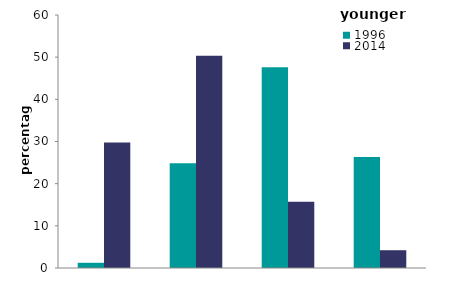
| Category | 1996 | 2014 |
|---|---|---|
| A-C | 1.236 | 29.778 |
| D | 24.844 | 50.318 |
| E | 47.603 | 15.687 |
| F-G | 26.317 | 4.216 |